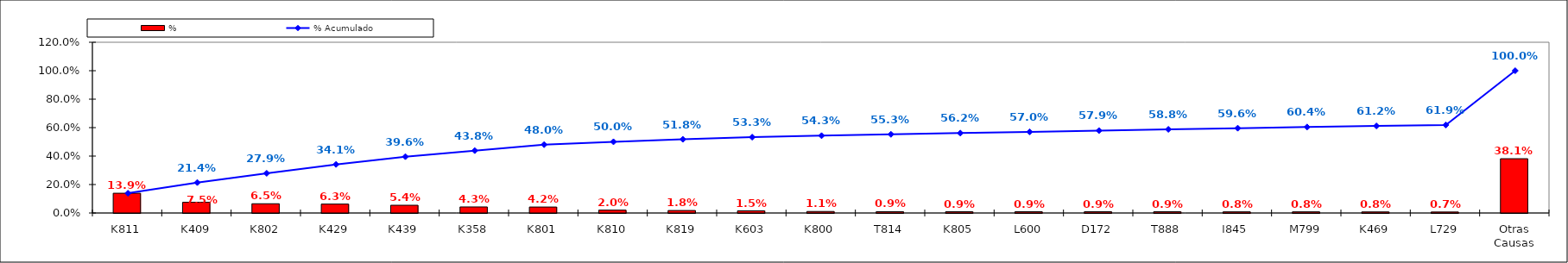
| Category | % |
|---|---|
| K811 | 0.139 |
| K409 | 0.075 |
| K802 | 0.065 |
| K429 | 0.063 |
| K439 | 0.054 |
| K358 | 0.043 |
| K801 | 0.042 |
| K810 | 0.02 |
| K819 | 0.018 |
| K603 | 0.015 |
| K800 | 0.011 |
| T814 | 0.009 |
| K805 | 0.009 |
| L600 | 0.009 |
| D172 | 0.009 |
| T888 | 0.009 |
| I845 | 0.008 |
| M799 | 0.008 |
| K469 | 0.008 |
| L729 | 0.007 |
| Otras Causas | 0.381 |